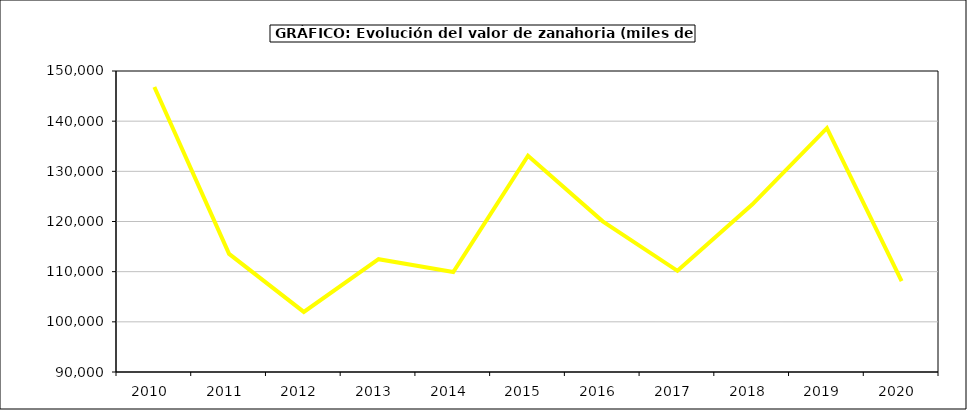
| Category | Valor |
|---|---|
| 2010.0 | 146811.606 |
| 2011.0 | 113537.975 |
| 2012.0 | 101980.864 |
| 2013.0 | 112485.085 |
| 2014.0 | 109919.203 |
| 2015.0 | 133120 |
| 2016.0 | 120031 |
| 2017.0 | 110169.914 |
| 2018.0 | 123370.95 |
| 2019.0 | 138615.206 |
| 2020.0 | 108091.405 |